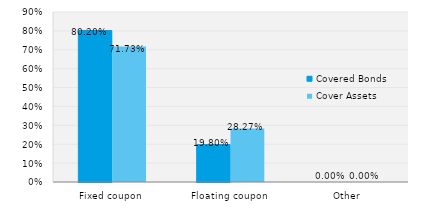
| Category | Covered Bonds | Cover Assets |
|---|---|---|
| Fixed coupon | 0.802 | 0.717 |
| Floating coupon | 0.198 | 0.283 |
| Other | 0 | 0 |